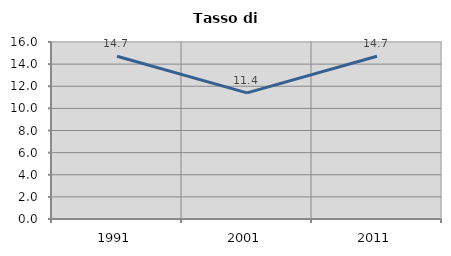
| Category | Tasso di disoccupazione   |
|---|---|
| 1991.0 | 14.717 |
| 2001.0 | 11.397 |
| 2011.0 | 14.706 |